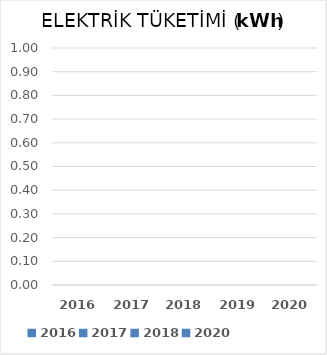
| Category | ELEKTRİK TÜKETİMİ (kWh) |
|---|---|
| 2016.0 | 0 |
| 2017.0 | 0 |
| 2018.0 | 0 |
| 2019.0 | 0 |
| 2020.0 | 0 |